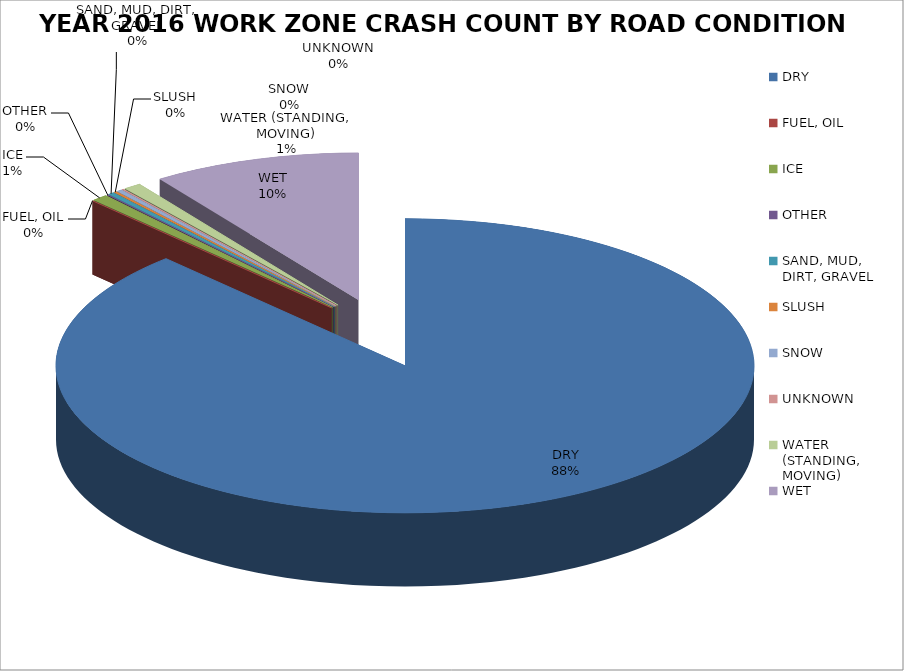
| Category | YEAR 2016 WORK ZONE CRASH COUNT* |
|---|---|
| DRY | 0.88 |
| FUEL, OIL | 0 |
| ICE | 0.007 |
| OTHER | 0.001 |
| SAND, MUD, DIRT, GRAVEL | 0.003 |
| SLUSH | 0.001 |
| SNOW | 0.003 |
| UNKNOWN | 0.001 |
| WATER (STANDING, MOVING) | 0.008 |
| WET | 0.096 |